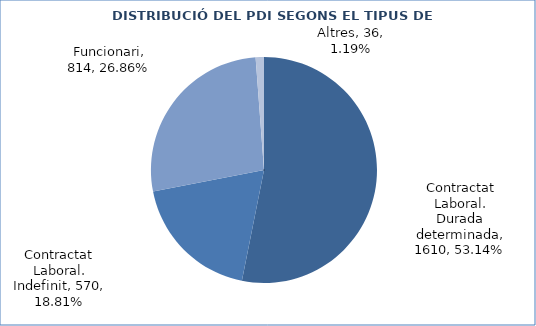
| Category | Series 0 |
|---|---|
| Contractat Laboral. Durada determinada | 1610 |
| Contractat Laboral. Indefinit | 570 |
| Funcionari | 814 |
| Altres | 36 |